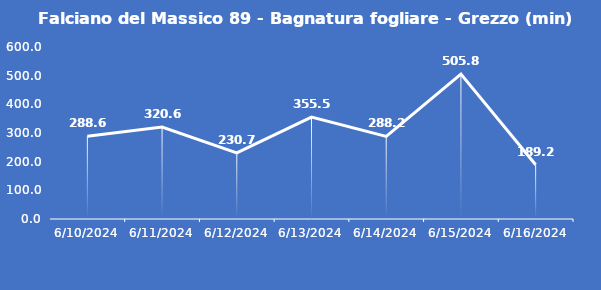
| Category | Falciano del Massico 89 - Bagnatura fogliare - Grezzo (min) |
|---|---|
| 6/10/24 | 288.6 |
| 6/11/24 | 320.6 |
| 6/12/24 | 230.7 |
| 6/13/24 | 355.5 |
| 6/14/24 | 288.2 |
| 6/15/24 | 505.8 |
| 6/16/24 | 189.2 |